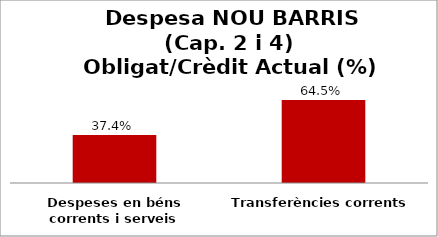
| Category | Series 0 |
|---|---|
| Despeses en béns corrents i serveis | 0.374 |
| Transferències corrents | 0.645 |